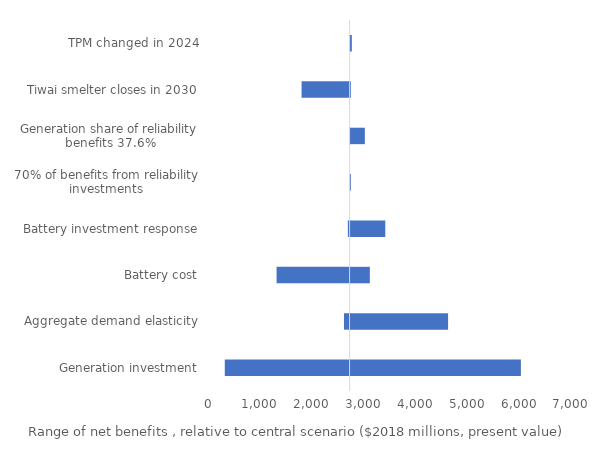
| Category | Series 0 | Series 1 |
|---|---|---|
| Generation investment | 5995.424 | 304.561 |
| Aggregate demand elasticity | 4591.303 | 2602.576 |
| Battery cost | 3082.281 | 1303.309 |
| Battery investment response | 3380.144 | 2677.708 |
| 70% of benefits from reliability investments | 2711.24 | 2711.197 |
| Generation share of reliability benefits 37.6% | 2711.24 | 2985.869 |
| Tiwai smelter closes in 2030 | 2711.24 | 1785.508 |
| TPM changed in 2024 | 2711.24 | 2735.197 |